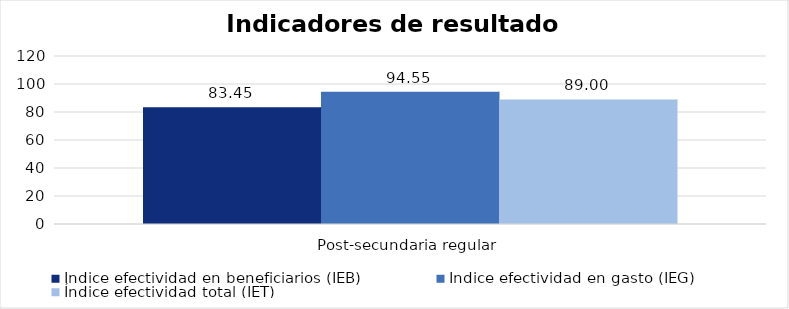
| Category | Índice efectividad en beneficiarios (IEB) | Índice efectividad en gasto (IEG)  | Índice efectividad total (IET) |
|---|---|---|---|
| Post-secundaria regular  | 83.454 | 94.55 | 89.002 |